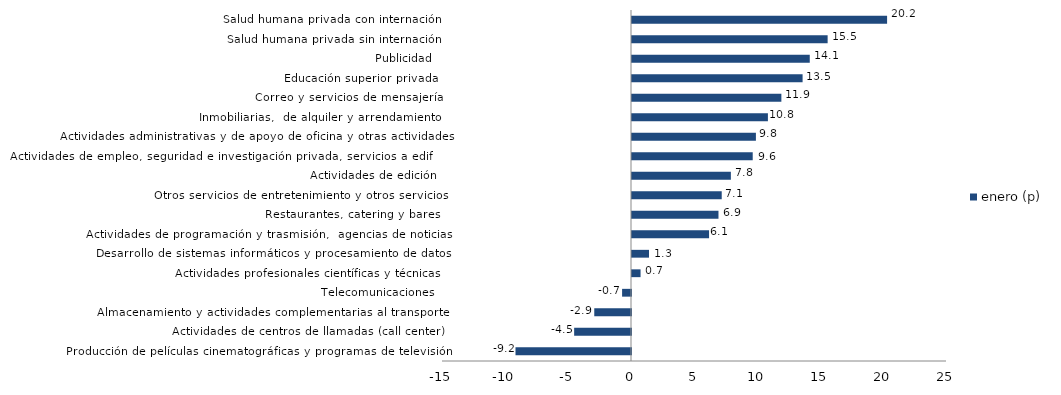
| Category | enero (p) |
|---|---|
| Producción de películas cinematográficas y programas de televisión | -9.166 |
| Actividades de centros de llamadas (call center) | -4.512 |
| Almacenamiento y actividades complementarias al transporte | -2.916 |
| Telecomunicaciones | -0.707 |
| Actividades profesionales científicas y técnicas  | 0.68 |
| Desarrollo de sistemas informáticos y procesamiento de datos | 1.349 |
| Actividades de programación y trasmisión,  agencias de noticias | 6.116 |
| Restaurantes, catering y bares | 6.863 |
| Otros servicios de entretenimiento y otros servicios | 7.121 |
| Actividades de edición | 7.847 |
| Actividades de empleo, seguridad e investigación privada, servicios a edificios | 9.581 |
| Actividades administrativas y de apoyo de oficina y otras actividades | 9.834 |
| Inmobiliarias,  de alquiler y arrendamiento  | 10.787 |
| Correo y servicios de mensajería | 11.855 |
| Educación superior privada | 13.539 |
| Publicidad | 14.108 |
| Salud humana privada sin internación | 15.526 |
| Salud humana privada con internación | 20.245 |